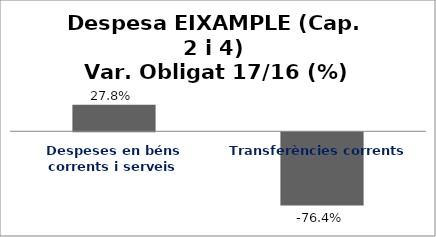
| Category | Series 0 |
|---|---|
| Despeses en béns corrents i serveis | 0.278 |
| Transferències corrents | -0.764 |